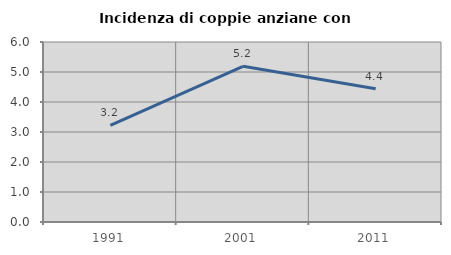
| Category | Incidenza di coppie anziane con figli |
|---|---|
| 1991.0 | 3.219 |
| 2001.0 | 5.19 |
| 2011.0 | 4.442 |